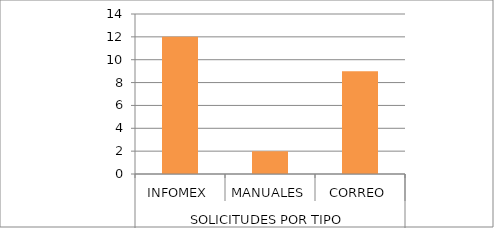
| Category | Series 0 |
|---|---|
| 0 | 12 |
| 1 | 2 |
| 2 | 9 |